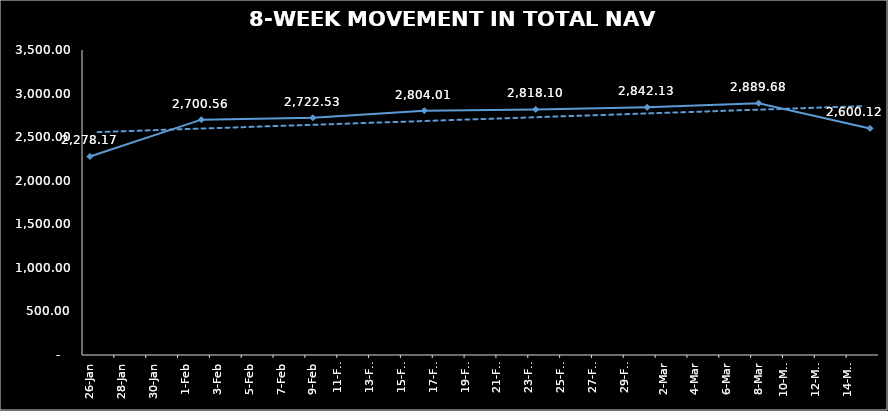
| Category | TOTAL NAV |
|---|---|
| 2024-01-26 | 2278.172 |
| 2024-02-02 | 2700.559 |
| 2024-02-09 | 2722.532 |
| 2024-02-16 | 2804.014 |
| 2024-02-23 | 2818.099 |
| 2024-03-01 | 2842.127 |
| 2024-03-08 | 2889.675 |
| 2024-03-15 | 2600.12 |